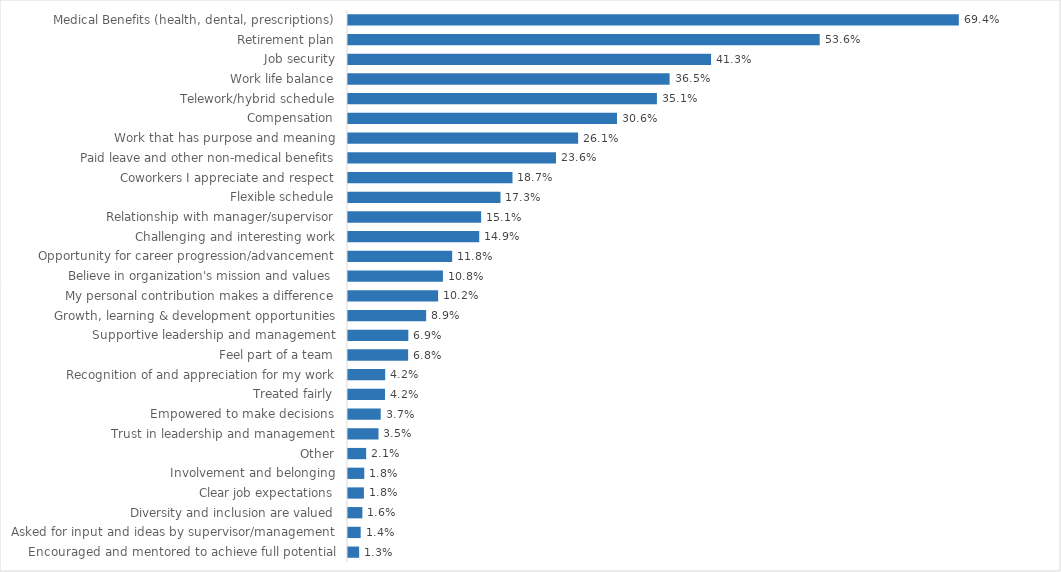
| Category | Series 0 |
|---|---|
| Medical Benefits (health, dental, prescriptions) | 0.694 |
| Retirement plan | 0.536 |
| Job security | 0.413 |
| Work life balance | 0.365 |
| Telework/hybrid schedule | 0.351 |
| Compensation | 0.306 |
| Work that has purpose and meaning | 0.261 |
| Paid leave and other non-medical benefits | 0.236 |
| Coworkers I appreciate and respect | 0.187 |
| Flexible schedule | 0.173 |
| Relationship with manager/supervisor | 0.151 |
| Challenging and interesting work | 0.149 |
| Opportunity for career progression/advancement | 0.118 |
| Believe in organization's mission and values | 0.108 |
| My personal contribution makes a difference | 0.102 |
| Growth, learning & development opportunities | 0.089 |
| Supportive leadership and management | 0.069 |
| Feel part of a team | 0.068 |
| Recognition of and appreciation for my work | 0.042 |
| Treated fairly | 0.042 |
| Empowered to make decisions | 0.037 |
| Trust in leadership and management | 0.035 |
| Other | 0.021 |
| Involvement and belonging | 0.018 |
| Clear job expectations | 0.018 |
| Diversity and inclusion are valued | 0.016 |
| Asked for input and ideas by supervisor/management | 0.014 |
| Encouraged and mentored to achieve full potential | 0.013 |